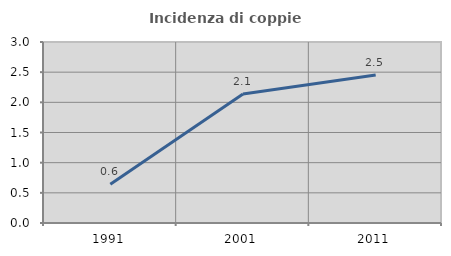
| Category | Incidenza di coppie miste |
|---|---|
| 1991.0 | 0.643 |
| 2001.0 | 2.138 |
| 2011.0 | 2.452 |